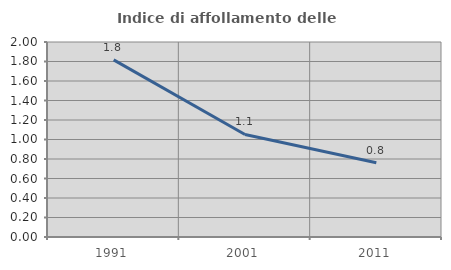
| Category | Indice di affollamento delle abitazioni  |
|---|---|
| 1991.0 | 1.816 |
| 2001.0 | 1.052 |
| 2011.0 | 0.762 |